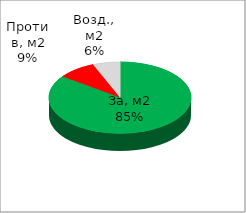
| Category | Series 0 |
|---|---|
| За, м2 | 0.851 |
| Против, м2 | 0.088 |
| Возд., м2 | 0.062 |